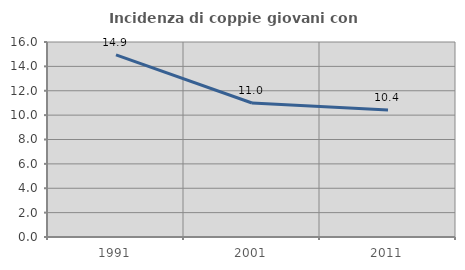
| Category | Incidenza di coppie giovani con figli |
|---|---|
| 1991.0 | 14.946 |
| 2001.0 | 10.992 |
| 2011.0 | 10.411 |